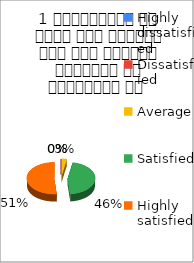
| Category | 1 व्याख्यान से रूचि में वृद्धि हुई एवं शिक्षण जानकारी से परिपूर्ण था  |
|---|---|
| Highly dissatisfied | 0 |
| Dissatisfied | 0 |
| Average | 1 |
| Satisfied | 16 |
| Highly satisfied | 18 |